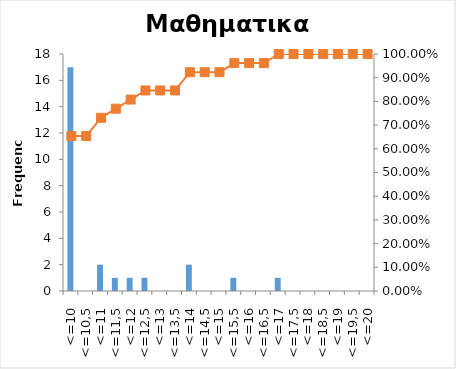
| Category | Series 0 |
|---|---|
| <=10 | 17 |
| <=10,5 | 0 |
| <=11 | 2 |
| <=11,5 | 1 |
| <=12 | 1 |
| <=12,5 | 1 |
| <=13 | 0 |
| <=13,5 | 0 |
| <=14 | 2 |
| <=14,5 | 0 |
| <=15 | 0 |
| <=15,5 | 1 |
| <=16 | 0 |
| <=16,5 | 0 |
| <=17 | 1 |
| <=17,5 | 0 |
| <=18 | 0 |
| <=18,5 | 0 |
| <=19 | 0 |
| <=19,5 | 0 |
| <=20 | 0 |